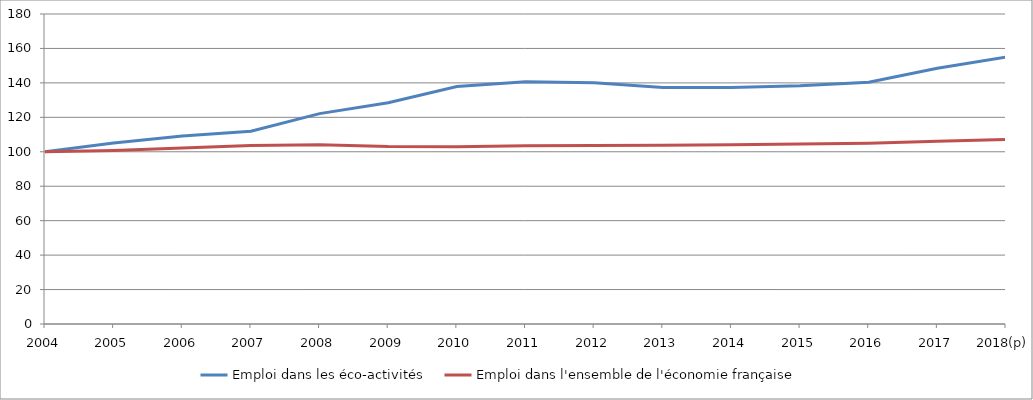
| Category | Emploi dans les éco-activités | Emploi dans l'ensemble de l'économie française |
|---|---|---|
| 2004 | 100 | 100 |
| 2005 | 105.083 | 100.699 |
| 2006 | 109.223 | 102.156 |
| 2007 | 111.978 | 103.704 |
| 2008 | 122.167 | 104.142 |
| 2009 | 128.475 | 103.002 |
| 2010 | 137.869 | 102.986 |
| 2011 | 140.656 | 103.494 |
| 2012 | 140.115 | 103.61 |
| 2013 | 137.292 | 103.752 |
| 2014 | 137.336 | 104.107 |
| 2015 | 138.273 | 104.456 |
| 2016 | 140.354 | 104.928 |
| 2017 | 148.45 | 106.088 |
| 2018(p) | 154.924 | 107.2 |